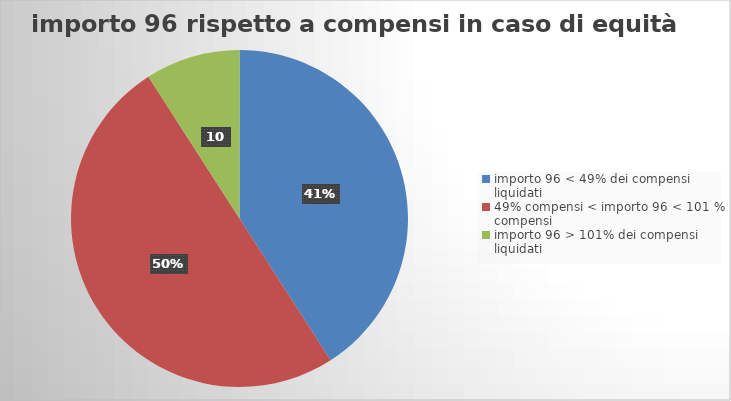
| Category | Series 0 | Series 1 |
|---|---|---|
| importo 96 < 49% dei compensi liquidati | 9 | 0.41 |
| 49% compensi < importo 96 < 101 % compensi | 11 | 0.5 |
| importo 96 > 101% dei compensi liquidati | 2 | 0.09 |